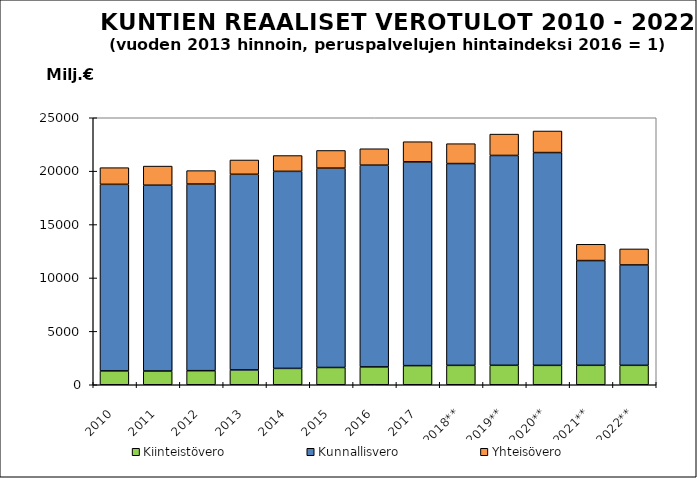
| Category | Kiinteistövero | Kunnallisvero | Yhteisövero |
|---|---|---|---|
| 2010 | 1296.352 | 17470.608 | 1559.108 |
| 2011 | 1285.841 | 17398.198 | 1789.548 |
| 2012 | 1317.524 | 17476.044 | 1257.689 |
| 2013 | 1389.588 | 18317.532 | 1337.058 |
| 2014 | 1532.817 | 18447.864 | 1481.581 |
| 2015 | 1616.418 | 18667.185 | 1654.236 |
| 2016 | 1669.703 | 18890.563 | 1537.872 |
| 2017 | 1790.628 | 19079.061 | 1886.129 |
| 2018** | 1816.323 | 18894.526 | 1861.431 |
| 2019** | 1821.985 | 19647.895 | 1999.26 |
| 2020** | 1815.785 | 19925.347 | 2018.612 |
| 2021** | 1820.429 | 9807.444 | 1524.967 |
| 2022** | 1819.689 | 9398.597 | 1500.774 |